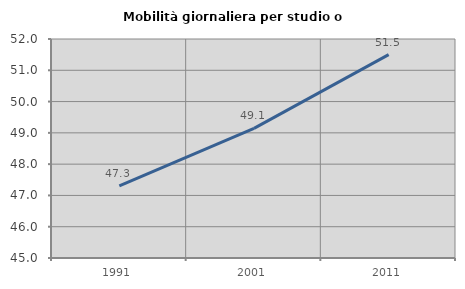
| Category | Mobilità giornaliera per studio o lavoro |
|---|---|
| 1991.0 | 47.308 |
| 2001.0 | 49.141 |
| 2011.0 | 51.501 |